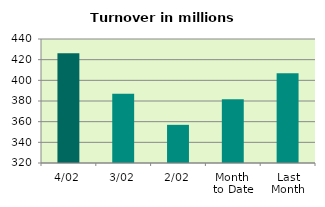
| Category | Series 0 |
|---|---|
| 4/02 | 426.1 |
| 3/02 | 387.073 |
| 2/02 | 356.928 |
| Month 
to Date | 381.717 |
| Last
Month | 406.741 |